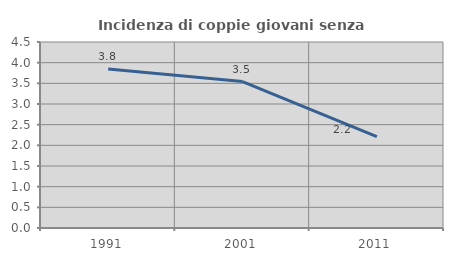
| Category | Incidenza di coppie giovani senza figli |
|---|---|
| 1991.0 | 3.846 |
| 2001.0 | 3.543 |
| 2011.0 | 2.208 |